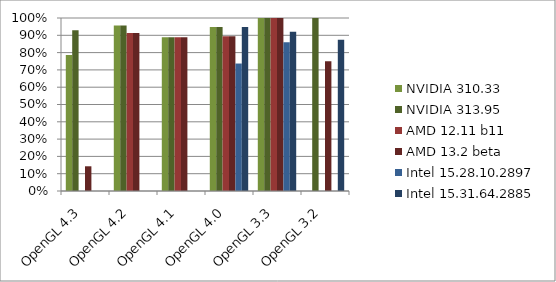
| Category | NVIDIA 310.33 | NVIDIA 313.95 | AMD 12.11 b11 | AMD 13.2 beta | Intel 15.28.10.2897 | Intel 15.31.64.2885 |
|---|---|---|---|---|---|---|
| OpenGL 4.3 | 0.786 | 0.929 | 0 | 0.143 | 0 | 0 |
| OpenGL 4.2 | 0.957 | 0.957 | 0.913 | 0.913 | 0 | 0 |
| OpenGL 4.1 | 0.889 | 0.889 | 0.889 | 0.889 | 0 | 0 |
| OpenGL 4.0 | 0.947 | 0.947 | 0.895 | 0.895 | 0.737 | 0.947 |
| OpenGL 3.3 | 1 | 1 | 1 | 1 | 0.86 | 0.92 |
| OpenGL 3.2 | 0 | 1 | 0 | 0.75 | 0 | 0.875 |